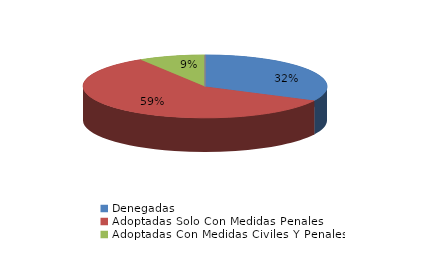
| Category | Series 0 |
|---|---|
| Denegadas | 11 |
| Adoptadas Solo Con Medidas Penales | 20 |
| Adoptadas Con Medidas Civiles Y Penales | 3 |
| Adoptadas Con Medidas Solo Civiles | 0 |